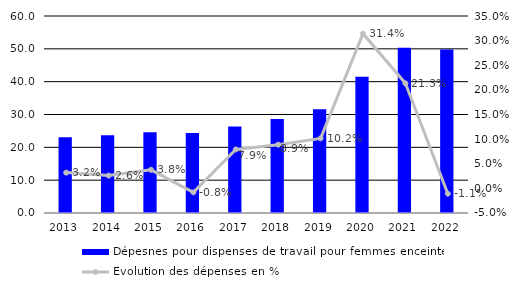
| Category | Dépesnes pour dispenses de travail pour femmes enceintes |
|---|---|
| 2013.0 | 23.1 |
| 2014.0 | 23.7 |
| 2015.0 | 24.593 |
| 2016.0 | 24.395 |
| 2017.0 | 26.325 |
| 2018.0 | 28.662 |
| 2019.0 | 31.571 |
| 2020.0 | 41.489 |
| 2021.0 | 50.34 |
| 2022.0 | 49.795 |